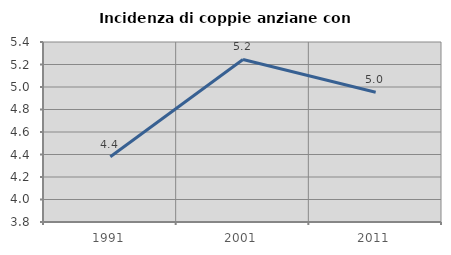
| Category | Incidenza di coppie anziane con figli |
|---|---|
| 1991.0 | 4.38 |
| 2001.0 | 5.245 |
| 2011.0 | 4.954 |